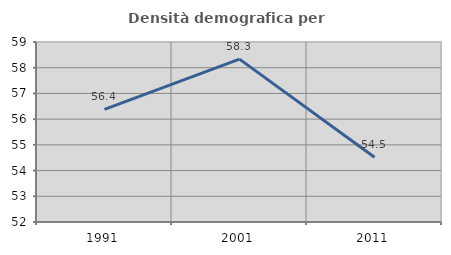
| Category | Densità demografica |
|---|---|
| 1991.0 | 56.38 |
| 2001.0 | 58.333 |
| 2011.0 | 54.519 |